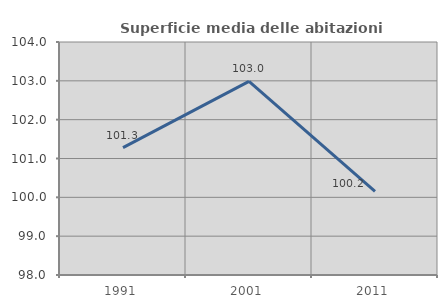
| Category | Superficie media delle abitazioni occupate |
|---|---|
| 1991.0 | 101.28 |
| 2001.0 | 102.987 |
| 2011.0 | 100.152 |